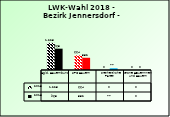
| Category | 2013 | 2018 |
|---|---|---|
| Bgld. Bauernbund | 1225 | 963 |
| SPÖ Bauern | 664 | 552 |
| Freiheitliche Partei | 0 | 77 |
| Grüne Bäuerinnen und Bauern | 0 | 0 |